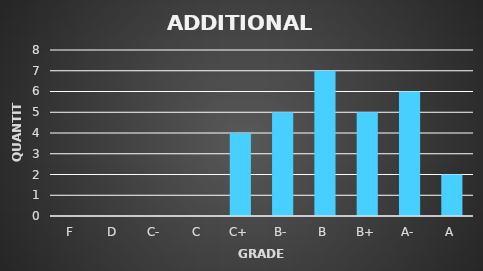
| Category | Series 0 |
|---|---|
| F | 0 |
| D | 0 |
| C- | 0 |
| C | 0 |
| C+ | 4 |
| B- | 5 |
| B | 7 |
| B+ | 5 |
| A- | 6 |
| A | 2 |